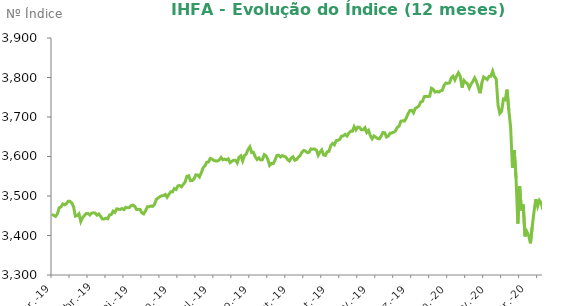
| Category | Series 0 |
|---|---|
| 2019-03-01 | 3453.9 |
| 2019-03-06 | 3450.98 |
| 2019-03-07 | 3448.38 |
| 2019-03-08 | 3454.71 |
| 2019-03-11 | 3470.55 |
| 2019-03-12 | 3472 |
| 2019-03-13 | 3479.8 |
| 2019-03-14 | 3477.46 |
| 2019-03-15 | 3480.44 |
| 2019-03-18 | 3486.81 |
| 2019-03-19 | 3486.47 |
| 2019-03-20 | 3482.55 |
| 2019-03-21 | 3472.66 |
| 2019-03-22 | 3448.91 |
| 2019-03-25 | 3450.49 |
| 2019-03-26 | 3455.04 |
| 2019-03-27 | 3435.26 |
| 2019-03-28 | 3445.23 |
| 2019-03-29 | 3450.55 |
| 2019-04-01 | 3455.53 |
| 2019-04-02 | 3455.96 |
| 2019-04-03 | 3451.66 |
| 2019-04-04 | 3456.6 |
| 2019-04-05 | 3457.46 |
| 2019-04-08 | 3456.75 |
| 2019-04-09 | 3451.45 |
| 2019-04-10 | 3454.53 |
| 2019-04-11 | 3448.57 |
| 2019-04-12 | 3441.68 |
| 2019-04-15 | 3441.78 |
| 2019-04-16 | 3443.8 |
| 2019-04-17 | 3442.35 |
| 2019-04-18 | 3452.15 |
| 2019-04-22 | 3453.19 |
| 2019-04-23 | 3461.68 |
| 2019-04-24 | 3458.64 |
| 2019-04-25 | 3467.48 |
| 2019-04-26 | 3466.45 |
| 2019-04-29 | 3465.96 |
| 2019-04-30 | 3468.43 |
| 2019-05-02 | 3465.48 |
| 2019-05-03 | 3471.48 |
| 2019-05-06 | 3470.29 |
| 2019-05-07 | 3470.76 |
| 2019-05-08 | 3475.74 |
| 2019-05-09 | 3476.77 |
| 2019-05-10 | 3473.98 |
| 2019-05-13 | 3465.77 |
| 2019-05-14 | 3466.3 |
| 2019-05-15 | 3465.94 |
| 2019-05-16 | 3457.25 |
| 2019-05-17 | 3454.72 |
| 2019-05-20 | 3462.51 |
| 2019-05-21 | 3472.72 |
| 2019-05-22 | 3472.85 |
| 2019-05-23 | 3474.52 |
| 2019-05-24 | 3473.72 |
| 2019-05-27 | 3478.96 |
| 2019-05-28 | 3491.5 |
| 2019-05-29 | 3494.91 |
| 2019-05-30 | 3498.04 |
| 2019-05-31 | 3500.7 |
| 2019-06-03 | 3501.03 |
| 2019-06-04 | 3503.99 |
| 2019-06-05 | 3496.92 |
| 2019-06-06 | 3504.11 |
| 2019-06-07 | 3510.63 |
| 2019-06-10 | 3510.43 |
| 2019-06-11 | 3518.93 |
| 2019-06-12 | 3516.54 |
| 2019-06-13 | 3525.65 |
| 2019-06-14 | 3526.71 |
| 2019-06-17 | 3523.26 |
| 2019-06-18 | 3529.37 |
| 2019-06-19 | 3535.22 |
| 2019-06-21 | 3550.18 |
| 2019-06-24 | 3551.32 |
| 2019-06-25 | 3538.83 |
| 2019-06-26 | 3539.32 |
| 2019-06-27 | 3543.3 |
| 2019-06-28 | 3553.65 |
| 2019-07-01 | 3553.04 |
| 2019-07-02 | 3548.42 |
| 2019-07-03 | 3558.97 |
| 2019-07-04 | 3571.32 |
| 2019-07-05 | 3576.12 |
| 2019-07-08 | 3585.51 |
| 2019-07-09 | 3586.05 |
| 2019-07-10 | 3595.15 |
| 2019-07-11 | 3593.46 |
| 2019-07-12 | 3589.89 |
| 2019-07-15 | 3588.83 |
| 2019-07-16 | 3588.57 |
| 2019-07-17 | 3591.38 |
| 2019-07-18 | 3597.59 |
| 2019-07-19 | 3591.67 |
| 2019-07-22 | 3593.35 |
| 2019-07-23 | 3591.51 |
| 2019-07-24 | 3594.15 |
| 2019-07-25 | 3584.45 |
| 2019-07-26 | 3587.89 |
| 2019-07-29 | 3590.73 |
| 2019-07-30 | 3590.33 |
| 2019-07-31 | 3583.69 |
| 2019-08-01 | 3598.05 |
| 2019-08-02 | 3601.69 |
| 2019-08-05 | 3588.68 |
| 2019-08-06 | 3602.24 |
| 2019-08-07 | 3606.34 |
| 2019-08-08 | 3617.72 |
| 2019-08-09 | 3624.53 |
| 2019-08-12 | 3610.34 |
| 2019-08-13 | 3610.55 |
| 2019-08-14 | 3599.38 |
| 2019-08-15 | 3592.43 |
| 2019-08-16 | 3596.68 |
| 2019-08-19 | 3591.12 |
| 2019-08-20 | 3591.86 |
| 2019-08-21 | 3604.7 |
| 2019-08-22 | 3601.78 |
| 2019-08-23 | 3592.65 |
| 2019-08-26 | 3577.37 |
| 2019-08-27 | 3582.55 |
| 2019-08-28 | 3582.03 |
| 2019-08-29 | 3590.8 |
| 2019-08-30 | 3602.48 |
| 2019-09-02 | 3603.44 |
| 2019-09-03 | 3598.71 |
| 2019-09-04 | 3602.27 |
| 2019-09-05 | 3600.4 |
| 2019-09-06 | 3598.84 |
| 2019-09-09 | 3591.95 |
| 2019-09-10 | 3588.45 |
| 2019-09-11 | 3596.16 |
| 2019-09-12 | 3599.3 |
| 2019-09-13 | 3590.4 |
| 2019-09-16 | 3592.25 |
| 2019-09-17 | 3598.49 |
| 2019-09-18 | 3602.45 |
| 2019-09-19 | 3611.08 |
| 2019-09-20 | 3615.5 |
| 2019-09-23 | 3613.9 |
| 2019-09-24 | 3609.54 |
| 2019-09-25 | 3611.04 |
| 2019-09-26 | 3619.26 |
| 2019-09-27 | 3618.54 |
| 2019-09-30 | 3618.96 |
| 2019-10-01 | 3616.23 |
| 2019-10-02 | 3603.03 |
| 2019-10-03 | 3611.38 |
| 2019-10-04 | 3616.82 |
| 2019-10-07 | 3603.91 |
| 2019-10-08 | 3602.73 |
| 2019-10-09 | 3612.01 |
| 2019-10-10 | 3613.11 |
| 2019-10-11 | 3627.63 |
| 2019-10-14 | 3633.03 |
| 2019-10-15 | 3629.38 |
| 2019-10-16 | 3640.11 |
| 2019-10-17 | 3640.99 |
| 2019-10-18 | 3643.51 |
| 2019-10-21 | 3651.6 |
| 2019-10-22 | 3652.29 |
| 2019-10-23 | 3656.21 |
| 2019-10-24 | 3651.83 |
| 2019-10-25 | 3659.19 |
| 2019-10-28 | 3663.71 |
| 2019-10-29 | 3663.96 |
| 2019-10-30 | 3675.68 |
| 2019-10-31 | 3667.34 |
| 2019-11-01 | 3674.35 |
| 2019-11-04 | 3673.68 |
| 2019-11-05 | 3667.65 |
| 2019-11-06 | 3667.55 |
| 2019-11-07 | 3672.79 |
| 2019-11-08 | 3660.78 |
| 2019-11-11 | 3665.99 |
| 2019-11-12 | 3652.71 |
| 2019-11-13 | 3644.75 |
| 2019-11-14 | 3652.05 |
| 2019-11-18 | 3648.86 |
| 2019-11-19 | 3645.43 |
| 2019-11-20 | 3644.63 |
| 2019-11-21 | 3651.61 |
| 2019-11-22 | 3660.67 |
| 2019-11-25 | 3660.18 |
| 2019-11-26 | 3649.27 |
| 2019-11-27 | 3651.84 |
| 2019-11-28 | 3658.99 |
| 2019-11-29 | 3659.76 |
| 2019-12-02 | 3661.46 |
| 2019-12-03 | 3664.72 |
| 2019-12-04 | 3673.86 |
| 2019-12-05 | 3676.85 |
| 2019-12-06 | 3689.44 |
| 2019-12-09 | 3690.6 |
| 2019-12-10 | 3689.62 |
| 2019-12-11 | 3697.7 |
| 2019-12-12 | 3708.46 |
| 2019-12-13 | 3716.44 |
| 2019-12-16 | 3716.93 |
| 2019-12-17 | 3710.61 |
| 2019-12-18 | 3722.08 |
| 2019-12-19 | 3724.28 |
| 2019-12-20 | 3728.21 |
| 2019-12-23 | 3737.85 |
| 2019-12-24 | 3739.65 |
| 2019-12-26 | 3751.62 |
| 2019-12-27 | 3751.81 |
| 2019-12-30 | 3751.93 |
| 2019-12-31 | 3752.54 |
| 2020-01-02 | 3772.81 |
| 2020-01-03 | 3769.9 |
| 2020-01-06 | 3762.86 |
| 2020-01-07 | 3764.55 |
| 2020-01-08 | 3763.17 |
| 2020-01-09 | 3766.14 |
| 2020-01-10 | 3767.44 |
| 2020-01-13 | 3780.38 |
| 2020-01-14 | 3785.89 |
| 2020-01-15 | 3785.45 |
| 2020-01-16 | 3786.31 |
| 2020-01-17 | 3799.03 |
| 2020-01-20 | 3803.26 |
| 2020-01-21 | 3793.75 |
| 2020-01-22 | 3804.19 |
| 2020-01-23 | 3812.05 |
| 2020-01-24 | 3802.67 |
| 2020-01-27 | 3774.41 |
| 2020-01-28 | 3792.54 |
| 2020-01-29 | 3787.85 |
| 2020-01-30 | 3784.48 |
| 2020-01-31 | 3773.49 |
| 2020-02-03 | 3783.16 |
| 2020-02-04 | 3789.99 |
| 2020-02-05 | 3798.85 |
| 2020-02-06 | 3789.54 |
| 2020-02-07 | 3775.27 |
| 2020-02-10 | 3760.15 |
| 2020-02-11 | 3786.03 |
| 2020-02-12 | 3801.34 |
| 2020-02-13 | 3798.07 |
| 2020-02-14 | 3794.75 |
| 2020-02-17 | 3802.89 |
| 2020-02-18 | 3802.88 |
| 2020-02-19 | 3816.08 |
| 2020-02-20 | 3802.31 |
| 2020-02-21 | 3796.11 |
| 2020-02-26 | 3730.01 |
| 2020-02-27 | 3708.93 |
| 2020-02-28 | 3714.42 |
| 2020-03-02 | 3745.36 |
| 2020-03-03 | 3743.47 |
| 2020-03-04 | 3769.15 |
| 2020-03-05 | 3717.08 |
| 2020-03-06 | 3673.81 |
| 2020-03-09 | 3571.77 |
| 2020-03-10 | 3616.39 |
| 2020-03-11 | 3545.79 |
| 2020-03-12 | 3430.04 |
| 2020-03-13 | 3524.29 |
| 2020-03-16 | 3463.36 |
| 2020-03-17 | 3478.44 |
| 2020-03-18 | 3397.62 |
| 2020-03-19 | 3410.26 |
| 2020-03-20 | 3400.6 |
| 2020-03-23 | 3380.23 |
| 2020-03-24 | 3422.13 |
| 2020-03-25 | 3460.08 |
| 2020-03-26 | 3491.76 |
| 2020-03-27 | 3473.82 |
| 2020-03-30 | 3488.84 |
| 2020-03-31 | 3482.69 |
| 2020-04-01 | 3464.66 |